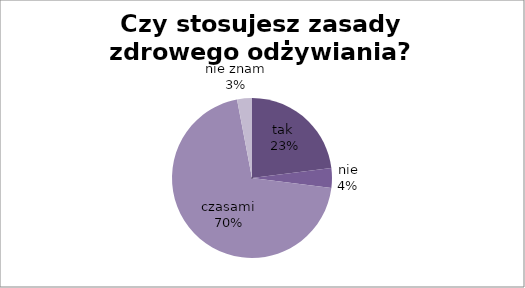
| Category | Czy stosujesz zasady zdrowego odżywiania? |
|---|---|
| tak  | 23 |
| nie | 4 |
| czasami | 70 |
| nie znam | 3 |